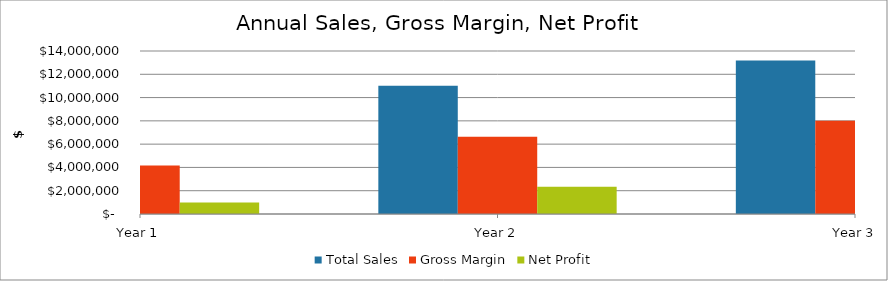
| Category | Total Sales | Gross Margin | Net Profit |
|---|---|---|---|
| Year 1 | 7170223.823 | 4157055.604 | 979779.109 |
| Year 2 | 11019460.033 | 6642127.405 | 2348219.134 |
| Year 3 | 13184972.252 | 8017868.921 | 3155869.934 |